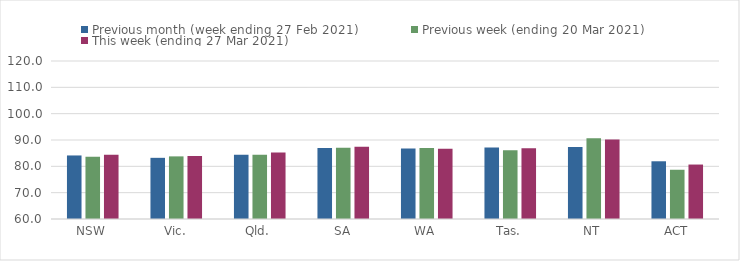
| Category | Previous month (week ending 27 Feb 2021) | Previous week (ending 20 Mar 2021) | This week (ending 27 Mar 2021) |
|---|---|---|---|
| NSW | 84.13 | 83.64 | 84.43 |
| Vic. | 83.23 | 83.78 | 83.92 |
| Qld. | 84.41 | 84.36 | 85.27 |
| SA | 86.98 | 87.09 | 87.41 |
| WA | 86.73 | 86.95 | 86.72 |
| Tas. | 87.14 | 86.12 | 86.83 |
| NT | 87.34 | 90.62 | 90.2 |
| ACT | 81.92 | 78.7 | 80.68 |